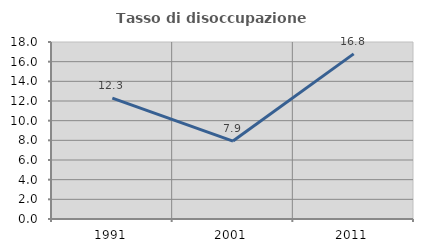
| Category | Tasso di disoccupazione giovanile  |
|---|---|
| 1991.0 | 12.284 |
| 2001.0 | 7.925 |
| 2011.0 | 16.795 |